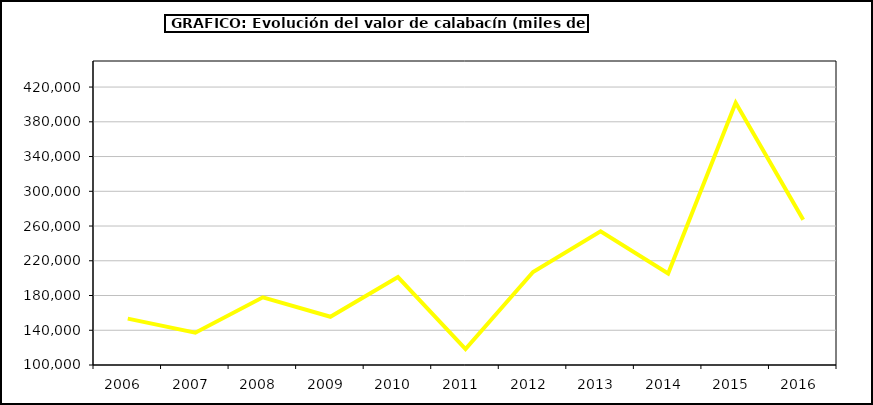
| Category | Valor |
|---|---|
| 2006.0 | 153425.95 |
| 2007.0 | 137236.942 |
| 2008.0 | 177885.879 |
| 2009.0 | 155520.785 |
| 2010.0 | 201170.752 |
| 2011.0 | 118311.354 |
| 2012.0 | 207035.363 |
| 2013.0 | 253994.073 |
| 2014.0 | 205307.232 |
| 2015.0 | 401801.34 |
| 2016.0 | 267259 |